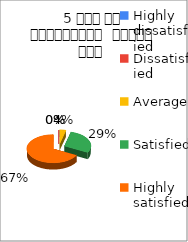
| Category | 5 समय पर पाठ्यक्रम  पूर्ण हुआ  |
|---|---|
| Highly dissatisfied | 0 |
| Dissatisfied | 0 |
| Average | 2 |
| Satisfied | 15 |
| Highly satisfied | 35 |